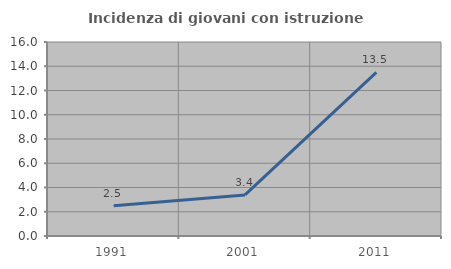
| Category | Incidenza di giovani con istruzione universitaria |
|---|---|
| 1991.0 | 2.491 |
| 2001.0 | 3.385 |
| 2011.0 | 13.495 |